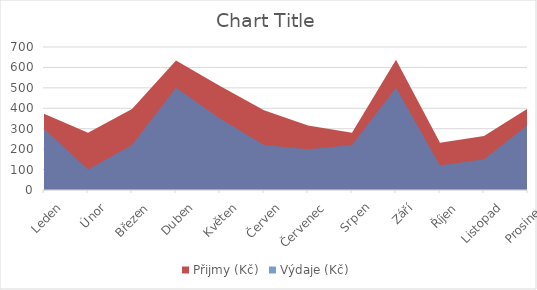
| Category | Přijmy (Kč) | Výdaje (Kč) |
|---|---|---|
| Leden | 373 | 300 |
| Únor | 280 | 100 |
| Březen | 396 | 220 |
| Duben | 634 | 500 |
| Květen | 509 | 350 |
| Červen | 390 | 220 |
| Červenec | 316 | 200 |
| Srpen | 280 | 220 |
| Září | 637 | 500 |
| Říjen | 231 | 120 |
| Listopad | 264 | 150 |
| Prosinec | 399 | 320 |